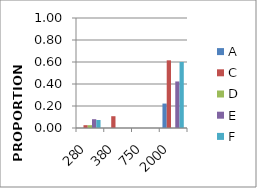
| Category | A | C | D | E | F |
|---|---|---|---|---|---|
| 280.0 | 0 | 0.026 | 0.026 | 0.08 | 0.073 |
| 380.0 | 0 | 0.107 | 0 | 0 | 0 |
| 750.0 | 0 | 0 | 0 | 0 | 0 |
| 2000.0 | 0.222 | 0.615 | 0 | 0.423 | 0.6 |